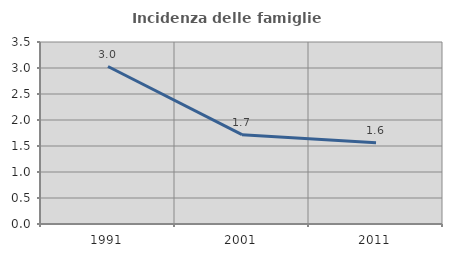
| Category | Incidenza delle famiglie numerose |
|---|---|
| 1991.0 | 3.028 |
| 2001.0 | 1.718 |
| 2011.0 | 1.561 |